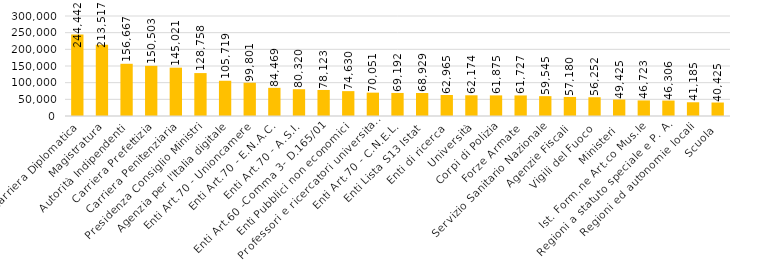
| Category | Series 0 |
|---|---|
| Carriera Diplomatica | 244441.733 |
| Magistratura | 213517.303 |
| Autorità Indipendenti | 156666.89 |
| Carriera Prefettizia | 150502.738 |
| Carriera Penitenziaria | 145020.663 |
| Presidenza Consiglio Ministri | 128758.291 |
| Agenzia per l'Italia digitale | 105719.413 |
| Enti Art.70 - Unioncamere | 99801.17 |
| Enti Art.70 - E.N.A.C. | 84468.563 |
| Enti Art.70 - A.S.I. | 80320.133 |
| Enti Art.60 -Comma 3- D.165/01 | 78123.133 |
| Enti Pubblici non economici | 74629.68 |
| Professori e ricercatori universitari | 70051.217 |
| Enti Art.70 - C.N.E.L. | 69191.763 |
| Enti Lista S13 Istat | 68929.232 |
| Enti di ricerca | 62965.259 |
| Università | 62173.625 |
| Corpi di Polizia | 61874.881 |
| Forze Armate | 61727.124 |
| Servizio Sanitario Nazionale | 59545.458 |
| Agenzie Fiscali | 57179.777 |
| Vigili del Fuoco | 56252.094 |
| Ministeri | 49424.972 |
| Ist. Form.ne Art.co Mus.le | 46722.806 |
| Regioni a statuto speciale e P. A. | 46305.533 |
| Regioni ed autonomie locali | 41184.551 |
| Scuola | 40424.621 |